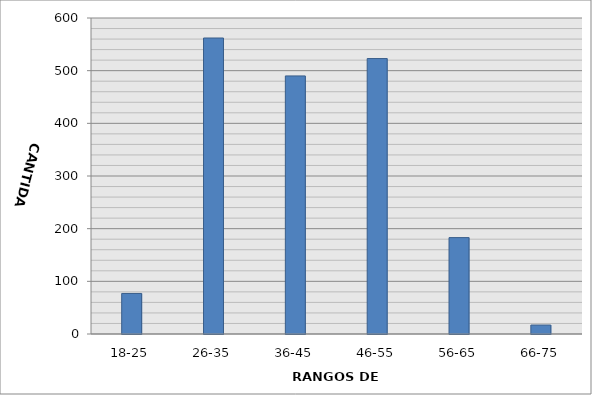
| Category | Series 0 |
|---|---|
| 18-25 | 77 |
| 26-35 | 562 |
| 36-45 | 490 |
| 46-55 | 523 |
| 56-65 | 183 |
| 66-75 | 17 |